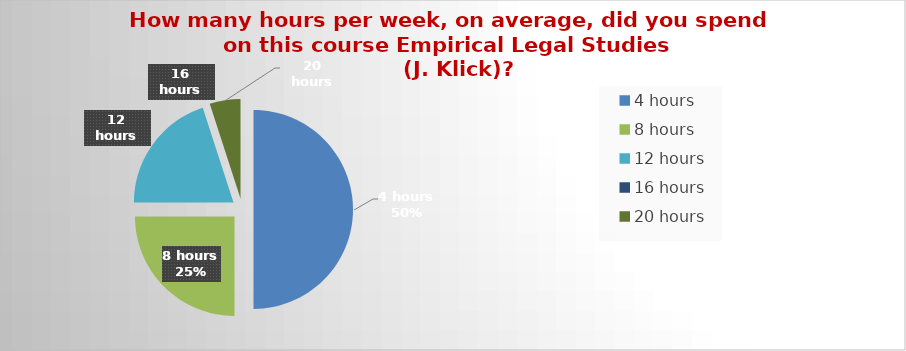
| Category | Series 0 |
|---|---|
| 4 hours | 10 |
| 8 hours | 5 |
| 12 hours | 4 |
| 16 hours | 0 |
| 20 hours | 1 |